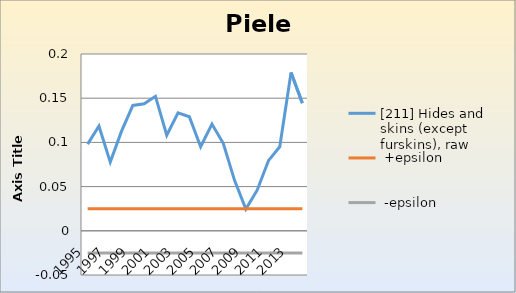
| Category | [211] Hides and skins (except furskins), raw |  +epsilon |  -epsilon |
|---|---|---|---|
| 1995.0 | 0.098 | 0.025 | -0.025 |
| 1996.0 | 0.118 | 0.025 | -0.025 |
| 1997.0 | 0.078 | 0.025 | -0.025 |
| 1998.0 | 0.113 | 0.025 | -0.025 |
| 1999.0 | 0.142 | 0.025 | -0.025 |
| 2000.0 | 0.144 | 0.025 | -0.025 |
| 2001.0 | 0.152 | 0.025 | -0.025 |
| 2002.0 | 0.108 | 0.025 | -0.025 |
| 2003.0 | 0.133 | 0.025 | -0.025 |
| 2004.0 | 0.129 | 0.025 | -0.025 |
| 2005.0 | 0.095 | 0.025 | -0.025 |
| 2006.0 | 0.121 | 0.025 | -0.025 |
| 2007.0 | 0.099 | 0.025 | -0.025 |
| 2008.0 | 0.057 | 0.025 | -0.025 |
| 2009.0 | 0.025 | 0.025 | -0.025 |
| 2010.0 | 0.046 | 0.025 | -0.025 |
| 2011.0 | 0.079 | 0.025 | -0.025 |
| 2012.0 | 0.095 | 0.025 | -0.025 |
| 2013.0 | 0.179 | 0.025 | -0.025 |
| 2014.0 | 0.144 | 0.025 | -0.025 |